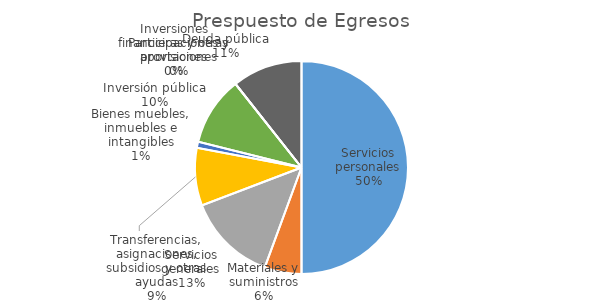
| Category | Series 0 |
|---|---|
| Servicios personales | 264172325.648 |
| Materiales y suministros | 29641338 |
| Servicios generales | 71863312 |
| Transferencias, asignaciones, subsidios y otras ayudas | 46252511 |
| Bienes muebles, inmuebles e intangibles | 4978334 |
| Inversión pública | 55206868 |
| Inversiones financieras y otras provisiones | 0 |
| Participaciones y aportaciones | 0 |
| Deuda pública | 56272030 |